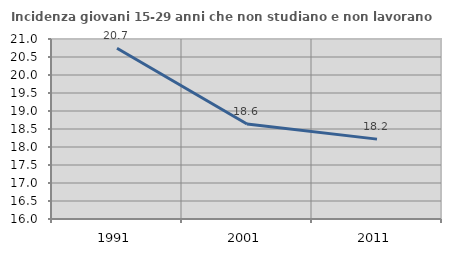
| Category | Incidenza giovani 15-29 anni che non studiano e non lavorano  |
|---|---|
| 1991.0 | 20.742 |
| 2001.0 | 18.637 |
| 2011.0 | 18.219 |